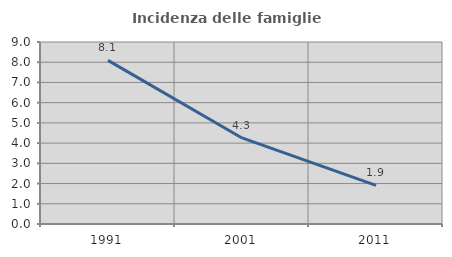
| Category | Incidenza delle famiglie numerose |
|---|---|
| 1991.0 | 8.092 |
| 2001.0 | 4.256 |
| 2011.0 | 1.913 |